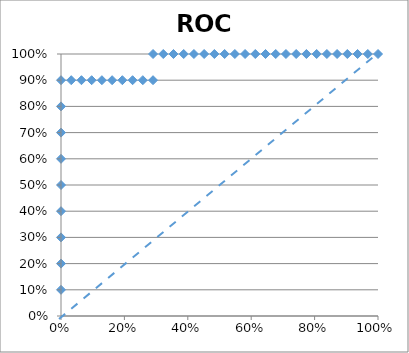
| Category | TPR |
|---|---|
| 0.0 | 0.1 |
| 0.0 | 0.2 |
| 0.0 | 0.3 |
| 0.0 | 0.4 |
| 0.0 | 0.5 |
| 0.0 | 0.6 |
| 0.0 | 0.7 |
| 0.0 | 0.8 |
| 0.0 | 0.9 |
| 0.03225806451612903 | 0.9 |
| 0.06451612903225806 | 0.9 |
| 0.0967741935483871 | 0.9 |
| 0.12903225806451613 | 0.9 |
| 0.16129032258064516 | 0.9 |
| 0.1935483870967742 | 0.9 |
| 0.22580645161290322 | 0.9 |
| 0.25806451612903225 | 0.9 |
| 0.2903225806451613 | 0.9 |
| 0.2903225806451613 | 1 |
| 0.3225806451612903 | 1 |
| 0.3548387096774194 | 1 |
| 0.3870967741935484 | 1 |
| 0.41935483870967744 | 1 |
| 0.45161290322580644 | 1 |
| 0.4838709677419355 | 1 |
| 0.5161290322580645 | 1 |
| 0.5483870967741935 | 1 |
| 0.5806451612903226 | 1 |
| 0.6129032258064516 | 1 |
| 0.6451612903225806 | 1 |
| 0.6774193548387096 | 1 |
| 0.7096774193548387 | 1 |
| 0.7419354838709677 | 1 |
| 0.7741935483870968 | 1 |
| 0.8064516129032258 | 1 |
| 0.8387096774193549 | 1 |
| 0.8709677419354839 | 1 |
| 0.9032258064516129 | 1 |
| 0.9354838709677419 | 1 |
| 0.967741935483871 | 1 |
| 1.0 | 1 |